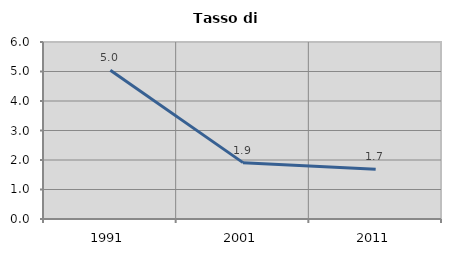
| Category | Tasso di disoccupazione   |
|---|---|
| 1991.0 | 5.039 |
| 2001.0 | 1.911 |
| 2011.0 | 1.69 |